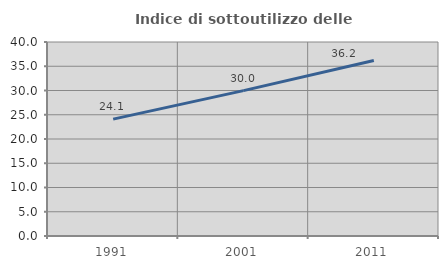
| Category | Indice di sottoutilizzo delle abitazioni  |
|---|---|
| 1991.0 | 24.095 |
| 2001.0 | 29.979 |
| 2011.0 | 36.202 |